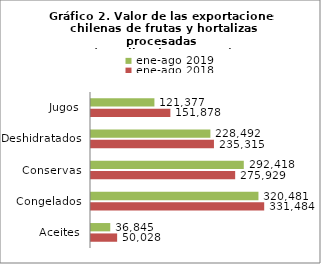
| Category | ene-ago 2018 | ene-ago 2019 |
|---|---|---|
| Aceites | 50028102.33 | 36845493.97 |
| Congelados | 331484087.59 | 320481134.89 |
| Conservas | 275929123.23 | 292417896.05 |
| Deshidratados | 235315345.73 | 228492149.06 |
| Jugos | 151877783.25 | 121376618.7 |